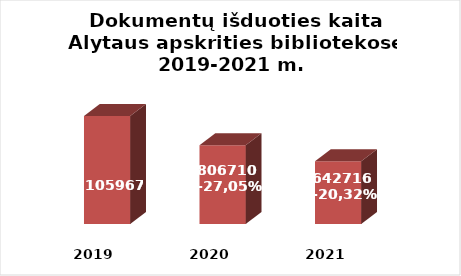
| Category | Series 0 |
|---|---|
| 2019.0 | 1105967 |
| 2020.0 | 806710 |
| 2021.0 | 642716 |